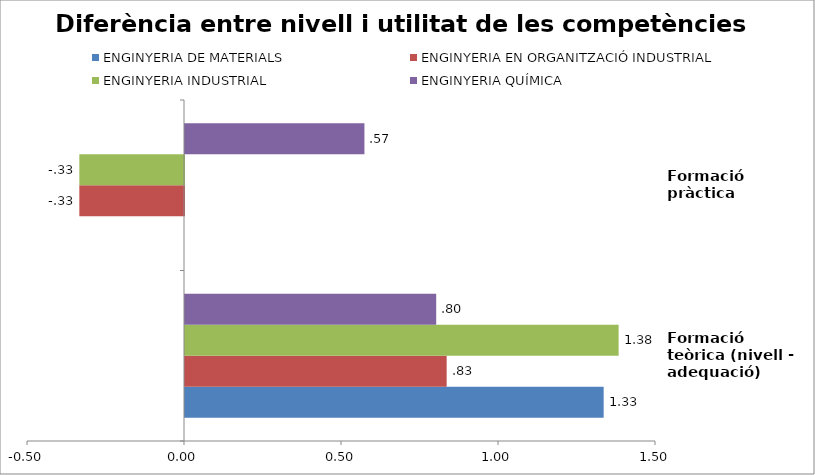
| Category | ENGINYERIA DE MATERIALS | ENGINYERIA EN ORGANITZACIÓ INDUSTRIAL | ENGINYERIA INDUSTRIAL | ENGINYERIA QUÍMICA |
|---|---|---|---|---|
| Formació teòrica (nivell - adequació) | 1.333 | 0.833 | 1.381 | 0.8 |
| Formació pràctica | 0 | -0.333 | -0.333 | 0.571 |